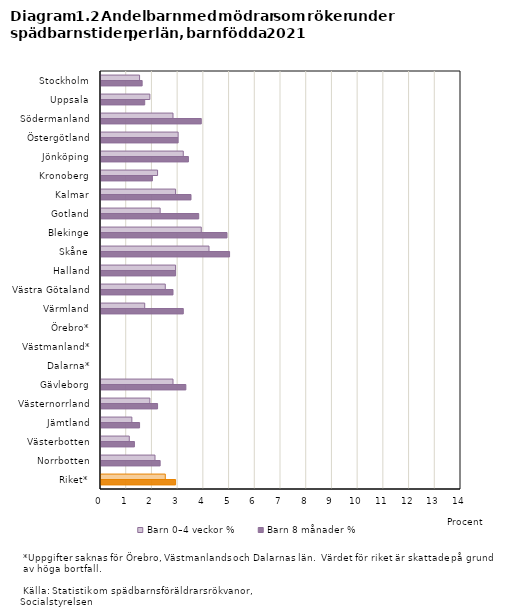
| Category | Barn 0–4 veckor % | Barn 8 månader % |
|---|---|---|
| Stockholm | 1.5 | 1.6 |
| Uppsala | 1.9 | 1.7 |
| Södermanland | 2.8 | 3.9 |
| Östergötland | 3 | 3 |
| Jönköping | 3.2 | 3.4 |
| Kronoberg | 2.2 | 2 |
| Kalmar | 2.9 | 3.5 |
| Gotland | 2.3 | 3.8 |
| Blekinge | 3.9 | 4.9 |
| Skåne | 4.2 | 5 |
| Halland | 2.9 | 2.9 |
| Västra Götaland | 2.5 | 2.8 |
| Värmland | 1.7 | 3.2 |
| Örebro* | 0 | 0 |
| Västmanland* | 0 | 0 |
| Dalarna* | 0 | 0 |
| Gävleborg | 2.8 | 3.3 |
| Västernorrland | 1.9 | 2.2 |
| Jämtland | 1.2 | 1.5 |
| Västerbotten | 1.1 | 1.3 |
| Norrbotten | 2.1 | 2.3 |
| Riket* | 2.5 | 2.9 |